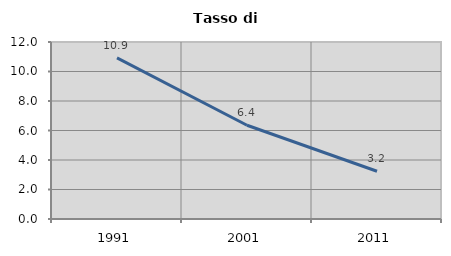
| Category | Tasso di disoccupazione   |
|---|---|
| 1991.0 | 10.922 |
| 2001.0 | 6.355 |
| 2011.0 | 3.237 |